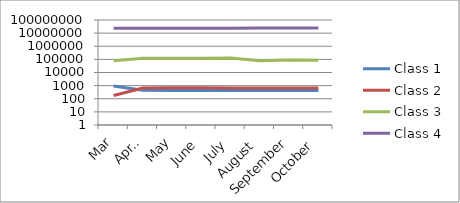
| Category | Class 1 | Class 2 | Class 3 | Class 4 |
|---|---|---|---|---|
| Mar | 930 | 179 | 80084 | 23996449 |
| April | 449 | 663 | 119857 | 23975239 |
| May | 420 | 686 | 121241 | 23988139 |
| June | 422 | 687 | 123483 | 24005430 |
| July | 427 | 658 | 125491 | 24038014 |
| August | 427 | 655 | 78827 | 24101362 |
| September | 429 | 650 | 88860 | 24110132 |
| October | 433 | 645 | 87615 | 24128941 |